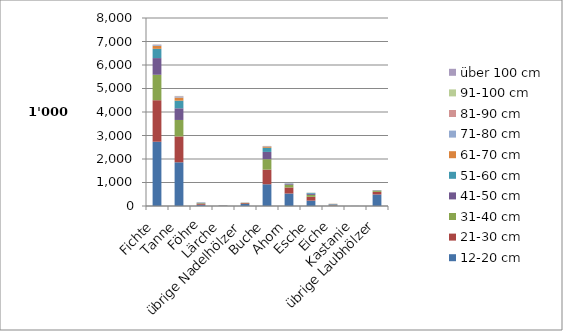
| Category | 12-20 cm | 21-30 cm | 31-40 cm | 41-50 cm | 51-60 cm | 61-70 cm | 71-80 cm | 81-90 cm | 91-100 cm | über 100 cm |
|---|---|---|---|---|---|---|---|---|---|---|
| Fichte | 2735 | 1766.3 | 1082.9 | 709.9 | 394.1 | 130.6 | 41.9 | 11.3 | 2.3 | 1 |
| Tanne | 1859.7 | 1100.7 | 700.6 | 496.6 | 324.6 | 132.4 | 49.4 | 15.2 | 5 | 0.5 |
| Föhre | 52.5 | 39 | 27.2 | 22.2 | 8.1 | 1 | 0 | 0 | 0 | 0 |
| Lärche | 8.7 | 3.8 | 4.5 | 4 | 2.1 | 2 | 0.5 | 0 | 0 | 0 |
| übrige Nadelhölzer | 84.5 | 35 | 14.7 | 5 | 2 | 3 | 1.5 | 0.5 | 0 | 0 |
| Buche | 923.9 | 623.4 | 445.2 | 308.6 | 176.4 | 55.4 | 17 | 4.9 | 1.9 | 0 |
| Ahorn | 530.4 | 259.2 | 118 | 40 | 11.7 | 2.9 | 0.8 | 0 | 0 | 0 |
| Esche | 228.4 | 163.6 | 81 | 50.7 | 35.5 | 4.6 | 1.6 | 1 | 0 | 0 |
| Eiche | 16.1 | 17.7 | 19 | 20.1 | 15.6 | 6.6 | 1 | 0.5 | 0 | 0 |
| Kastanie | 2.5 | 0 | 0 | 0 | 1.3 | 0 | 0 | 0 | 0 | 0 |
| übrige Laubhölzer | 489.8 | 111.6 | 50.5 | 15.2 | 4 | 0.5 | 0.5 | 0.5 | 0.5 | 0.5 |